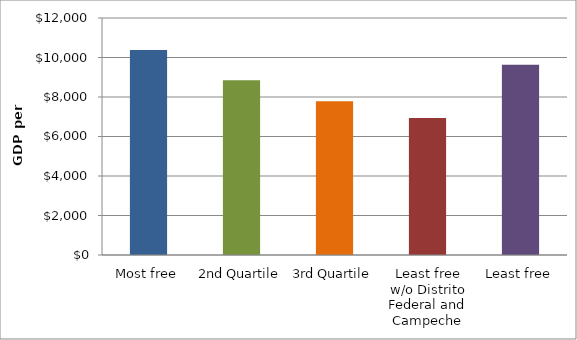
| Category | Series 0 |
|---|---|
| Most free | 10376.25 |
| 2nd Quartile | 8853.375 |
| 3rd Quartile | 7782.625 |
| Least free w/o Distrito Federal and Campeche | 6941.833 |
| Least free | 9634.25 |